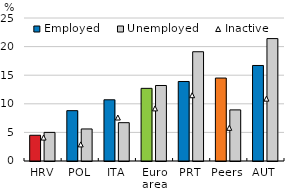
| Category | Employed | Unemployed |
|---|---|---|
| HRV | 4.5 | 5 |
| POL | 8.8 | 5.6 |
| ITA | 10.7 | 6.7 |
| Euro area | 12.7 | 13.2 |
| PRT | 13.9 | 19.1 |
| Peers | 14.5 | 8.933 |
| AUT | 16.7 | 21.4 |